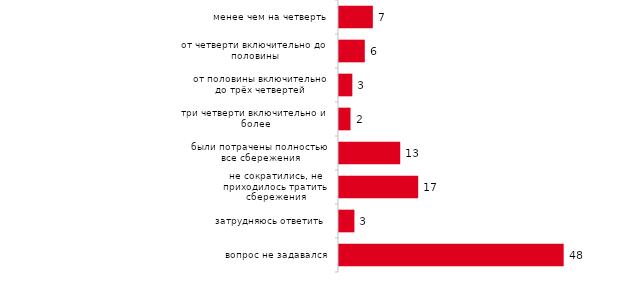
| Category | Series 0 |
|---|---|
| менее чем на четверть | 7.277 |
| от четверти включительно до половины | 5.545 |
| от половины включительно до трёх четвертей | 2.871 |
| три четверти включительно и более | 2.475 |
| были потрачены полностью все сбережения | 13.168 |
| не сократились, не приходилось тратить сбережения | 17.03 |
| затрудняюсь ответить | 3.317 |
| вопрос не задавался | 48.317 |